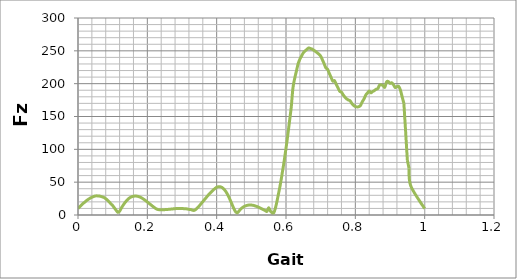
| Category | Series 0 |
|---|---|
| 0.0 | 9.695 |
| 0.005 | 12.709 |
| 0.01 | 15.236 |
| 0.015 | 17.707 |
| 0.02 | 19.771 |
| 0.025 | 22.106 |
| 0.03 | 23.938 |
| 0.035 | 25.651 |
| 0.04 | 27.071 |
| 0.045 | 28.096 |
| 0.05 | 29.003 |
| 0.055 | 29.128 |
| 0.06 | 28.98 |
| 0.065 | 28.478 |
| 0.07 | 27.594 |
| 0.075 | 26.656 |
| 0.08 | 24.782 |
| 0.085 | 22.596 |
| 0.09 | 19.927 |
| 0.095 | 16.996 |
| 0.1 | 14.423 |
| 0.105 | 10.745 |
| 0.11 | 7.255 |
| 0.115 | 4.006 |
| 0.12 | 5.832 |
| 0.125 | 10.541 |
| 0.13 | 14.726 |
| 0.135 | 18.467 |
| 0.14 | 21.724 |
| 0.145 | 24.421 |
| 0.15 | 26.491 |
| 0.155 | 27.855 |
| 0.16 | 28.525 |
| 0.165 | 28.849 |
| 0.17 | 28.694 |
| 0.175 | 28.067 |
| 0.18 | 26.996 |
| 0.185 | 25.566 |
| 0.19 | 23.847 |
| 0.195 | 21.914 |
| 0.2 | 19.839 |
| 0.205 | 17.697 |
| 0.21 | 15.557 |
| 0.215 | 13.464 |
| 0.22 | 11.497 |
| 0.225 | 9.61 |
| 0.23 | 8.415 |
| 0.235 | 8.034 |
| 0.24 | 7.915 |
| 0.245 | 8.001 |
| 0.25 | 8.143 |
| 0.255 | 8.457 |
| 0.26 | 8.553 |
| 0.265 | 8.801 |
| 0.27 | 9.088 |
| 0.275 | 9.361 |
| 0.28 | 9.629 |
| 0.285 | 9.868 |
| 0.29 | 10.027 |
| 0.295 | 9.854 |
| 0.3 | 9.99 |
| 0.305 | 9.647 |
| 0.31 | 9.5 |
| 0.315 | 9.216 |
| 0.32 | 8.572 |
| 0.325 | 8.373 |
| 0.33 | 7.297 |
| 0.335 | 7.06 |
| 0.34 | 8.616 |
| 0.345 | 11.138 |
| 0.35 | 13.941 |
| 0.355 | 17.166 |
| 0.36 | 20.317 |
| 0.365 | 23.498 |
| 0.37 | 26.691 |
| 0.375 | 29.788 |
| 0.38 | 32.746 |
| 0.385 | 35.514 |
| 0.39 | 38.036 |
| 0.395 | 40.256 |
| 0.4 | 42.126 |
| 0.405 | 43.066 |
| 0.41 | 43.05 |
| 0.415 | 42.005 |
| 0.42 | 39.925 |
| 0.425 | 36.785 |
| 0.43 | 32.608 |
| 0.435 | 27.486 |
| 0.44 | 21.615 |
| 0.445 | 15.345 |
| 0.45 | 9.252 |
| 0.455 | 4.669 |
| 0.46 | 3.504 |
| 0.465 | 6.46 |
| 0.47 | 9.349 |
| 0.475 | 11.499 |
| 0.48 | 13.092 |
| 0.485 | 14.229 |
| 0.49 | 14.932 |
| 0.495 | 15.23 |
| 0.5 | 15.153 |
| 0.505 | 14.74 |
| 0.51 | 14.043 |
| 0.515 | 13.125 |
| 0.52 | 12.031 |
| 0.525 | 10.817 |
| 0.53 | 9.509 |
| 0.535 | 8.143 |
| 0.54 | 6.776 |
| 0.545 | 5.495 |
| 0.55 | 11.091 |
| 0.555 | 5.941 |
| 0.56 | 3.434 |
| 0.565 | 3.648 |
| 0.57 | 11.67 |
| 0.575 | 23.419 |
| 0.58 | 36.689 |
| 0.585 | 50.375 |
| 0.59 | 66.69 |
| 0.595 | 83.044 |
| 0.6 | 101.423 |
| 0.605 | 120.956 |
| 0.61 | 142.222 |
| 0.615 | 163.741 |
| 0.62 | 193.226 |
| 0.625 | 207.798 |
| 0.63 | 219.097 |
| 0.635 | 230.288 |
| 0.64 | 237.21 |
| 0.645 | 242.232 |
| 0.65 | 246.998 |
| 0.655 | 249.85 |
| 0.66 | 251.961 |
| 0.665 | 254.289 |
| 0.67 | 253.631 |
| 0.675 | 252.702 |
| 0.68 | 250.937 |
| 0.685 | 249.166 |
| 0.69 | 247.071 |
| 0.695 | 244.817 |
| 0.7 | 241.972 |
| 0.705 | 236.424 |
| 0.71 | 230.411 |
| 0.715 | 224.019 |
| 0.72 | 221.87 |
| 0.725 | 215.53 |
| 0.73 | 209.671 |
| 0.735 | 203.798 |
| 0.74 | 204.549 |
| 0.745 | 198.894 |
| 0.75 | 193.488 |
| 0.755 | 188.407 |
| 0.76 | 187.115 |
| 0.765 | 182.965 |
| 0.77 | 179.499 |
| 0.775 | 176.837 |
| 0.78 | 175.1 |
| 0.785 | 173.86 |
| 0.79 | 169.791 |
| 0.795 | 166.936 |
| 0.8 | 165.221 |
| 0.805 | 164.575 |
| 0.81 | 164.905 |
| 0.815 | 166.91 |
| 0.82 | 172.359 |
| 0.825 | 176.741 |
| 0.83 | 182.595 |
| 0.835 | 185.755 |
| 0.84 | 188.842 |
| 0.845 | 186.037 |
| 0.85 | 188.073 |
| 0.855 | 189.542 |
| 0.86 | 191.481 |
| 0.865 | 192.566 |
| 0.87 | 197.933 |
| 0.875 | 198.234 |
| 0.88 | 197.171 |
| 0.885 | 194.505 |
| 0.89 | 202.685 |
| 0.895 | 203.248 |
| 0.9 | 200.42 |
| 0.905 | 201.31 |
| 0.91 | 198.317 |
| 0.915 | 194.05 |
| 0.92 | 195.556 |
| 0.925 | 195.881 |
| 0.93 | 190.266 |
| 0.935 | 180.035 |
| 0.94 | 170.145 |
| 0.945 | 127.846 |
| 0.95 | 83.599 |
| 0.955 | 71.003 |
| 0.96 | 44.142 |
| 1.0 | 9.695 |